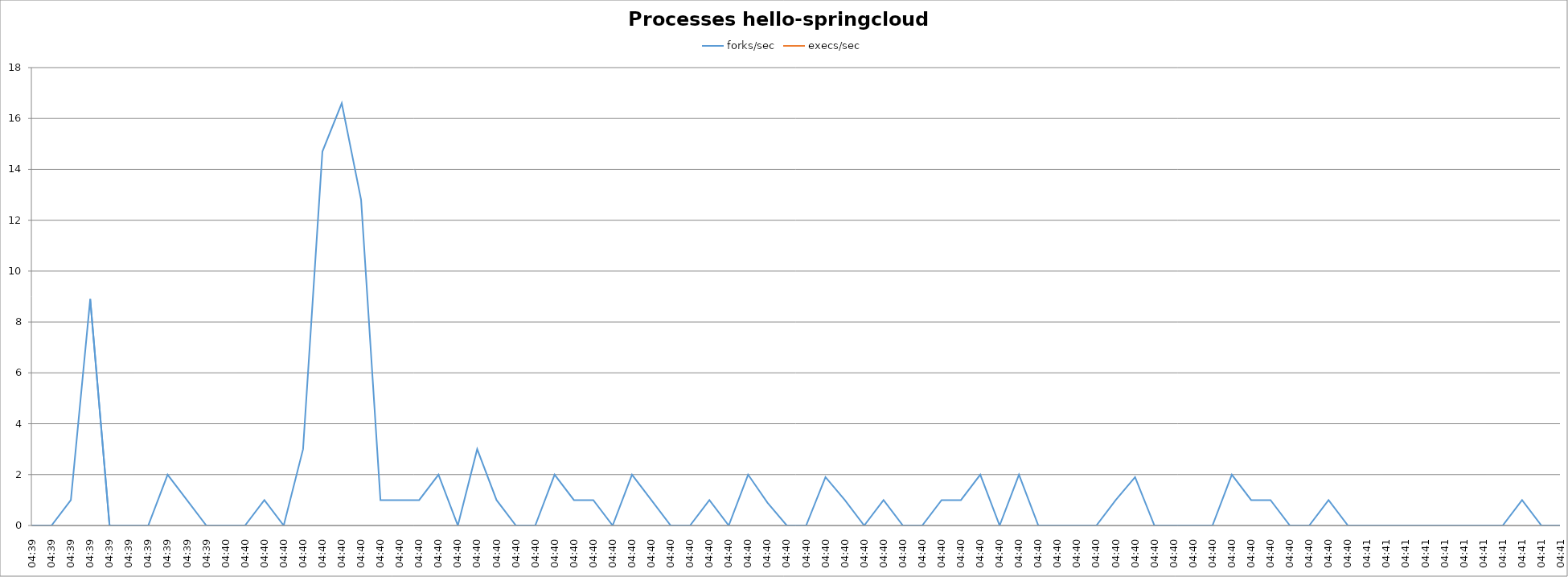
| Category | forks/sec | execs/sec |
|---|---|---|
| 04:39 | 0 | -1 |
| 04:39 | 0 | -1 |
| 04:39 | 1 | -1 |
| 04:39 | 8.9 | -1 |
| 04:39 | 0 | -1 |
| 04:39 | 0 | -1 |
| 04:39 | 0 | -1 |
| 04:39 | 2 | -1 |
| 04:39 | 1 | -1 |
| 04:39 | 0 | -1 |
| 04:40 | 0 | -1 |
| 04:40 | 0 | -1 |
| 04:40 | 1 | -1 |
| 04:40 | 0 | -1 |
| 04:40 | 3 | -1 |
| 04:40 | 14.7 | -1 |
| 04:40 | 16.6 | -1 |
| 04:40 | 12.8 | -1 |
| 04:40 | 1 | -1 |
| 04:40 | 1 | -1 |
| 04:40 | 1 | -1 |
| 04:40 | 2 | -1 |
| 04:40 | 0 | -1 |
| 04:40 | 3 | -1 |
| 04:40 | 1 | -1 |
| 04:40 | 0 | -1 |
| 04:40 | 0 | -1 |
| 04:40 | 2 | -1 |
| 04:40 | 1 | -1 |
| 04:40 | 1 | -1 |
| 04:40 | 0 | -1 |
| 04:40 | 2 | -1 |
| 04:40 | 1 | -1 |
| 04:40 | 0 | -1 |
| 04:40 | 0 | -1 |
| 04:40 | 1 | -1 |
| 04:40 | 0 | -1 |
| 04:40 | 2 | -1 |
| 04:40 | 0.9 | -1 |
| 04:40 | 0 | -1 |
| 04:40 | 0 | -1 |
| 04:40 | 1.9 | -1 |
| 04:40 | 1 | -1 |
| 04:40 | 0 | -1 |
| 04:40 | 1 | -1 |
| 04:40 | 0 | -1 |
| 04:40 | 0 | -1 |
| 04:40 | 1 | -1 |
| 04:40 | 1 | -1 |
| 04:40 | 2 | -1 |
| 04:40 | 0 | -1 |
| 04:40 | 2 | -1 |
| 04:40 | 0 | -1 |
| 04:40 | 0 | -1 |
| 04:40 | 0 | -1 |
| 04:40 | 0 | -1 |
| 04:40 | 1 | -1 |
| 04:40 | 1.9 | -1 |
| 04:40 | 0 | -1 |
| 04:40 | 0 | -1 |
| 04:40 | 0 | -1 |
| 04:40 | 0 | -1 |
| 04:40 | 2 | -1 |
| 04:40 | 1 | -1 |
| 04:40 | 1 | -1 |
| 04:40 | 0 | -1 |
| 04:40 | 0 | -1 |
| 04:40 | 1 | -1 |
| 04:40 | 0 | -1 |
| 04:41 | 0 | -1 |
| 04:41 | 0 | -1 |
| 04:41 | 0 | -1 |
| 04:41 | 0 | -1 |
| 04:41 | 0 | -1 |
| 04:41 | 0 | -1 |
| 04:41 | 0 | -1 |
| 04:41 | 0 | -1 |
| 04:41 | 1 | -1 |
| 04:41 | 0 | -1 |
| 04:41 | 0 | -1 |